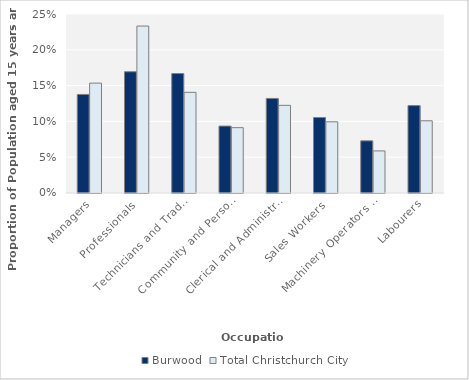
| Category | Burwood | Total Christchurch City |
|---|---|---|
| Managers | 0.138 | 0.153 |
| Professionals | 0.169 | 0.233 |
| Technicians and Trades Workers | 0.167 | 0.141 |
| Community and Personal Service Workers | 0.093 | 0.091 |
| Clerical and Administrative Workers | 0.132 | 0.122 |
| Sales Workers | 0.105 | 0.099 |
| Machinery Operators and Drivers | 0.073 | 0.059 |
| Labourers | 0.122 | 0.101 |